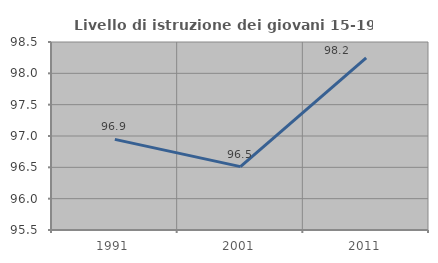
| Category | Livello di istruzione dei giovani 15-19 anni |
|---|---|
| 1991.0 | 96.947 |
| 2001.0 | 96.512 |
| 2011.0 | 98.246 |